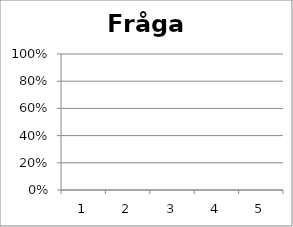
| Category | Fråga 4 |
|---|---|
| 0 | 0 |
| 1 | 0 |
| 2 | 0 |
| 3 | 0 |
| 4 | 0 |